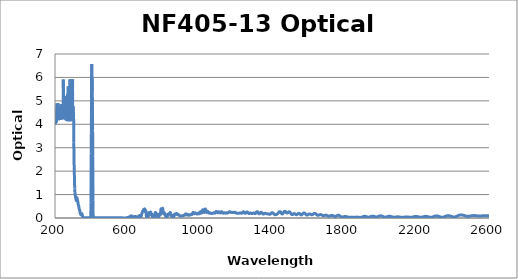
| Category | Optical Density |
|---|---|
| 2600.0 | 0.089 |
| 2599.0 | 0.09 |
| 2598.0 | 0.091 |
| 2597.0 | 0.091 |
| 2596.0 | 0.092 |
| 2595.0 | 0.093 |
| 2594.0 | 0.094 |
| 2593.0 | 0.095 |
| 2592.0 | 0.096 |
| 2591.0 | 0.096 |
| 2590.0 | 0.097 |
| 2589.0 | 0.098 |
| 2588.0 | 0.098 |
| 2587.0 | 0.099 |
| 2586.0 | 0.099 |
| 2585.0 | 0.1 |
| 2584.0 | 0.1 |
| 2583.0 | 0.1 |
| 2582.0 | 0.1 |
| 2581.0 | 0.1 |
| 2580.0 | 0.1 |
| 2579.0 | 0.1 |
| 2578.0 | 0.1 |
| 2577.0 | 0.1 |
| 2576.0 | 0.1 |
| 2575.0 | 0.099 |
| 2574.0 | 0.099 |
| 2573.0 | 0.099 |
| 2572.0 | 0.098 |
| 2571.0 | 0.098 |
| 2570.0 | 0.097 |
| 2569.0 | 0.096 |
| 2568.0 | 0.095 |
| 2567.0 | 0.095 |
| 2566.0 | 0.094 |
| 2565.0 | 0.093 |
| 2564.0 | 0.093 |
| 2563.0 | 0.092 |
| 2562.0 | 0.091 |
| 2561.0 | 0.09 |
| 2560.0 | 0.09 |
| 2559.0 | 0.089 |
| 2558.0 | 0.089 |
| 2557.0 | 0.088 |
| 2556.0 | 0.088 |
| 2555.0 | 0.087 |
| 2554.0 | 0.087 |
| 2553.0 | 0.087 |
| 2552.0 | 0.086 |
| 2551.0 | 0.086 |
| 2550.0 | 0.086 |
| 2549.0 | 0.085 |
| 2548.0 | 0.086 |
| 2547.0 | 0.086 |
| 2546.0 | 0.086 |
| 2545.0 | 0.086 |
| 2544.0 | 0.086 |
| 2543.0 | 0.087 |
| 2542.0 | 0.087 |
| 2541.0 | 0.088 |
| 2540.0 | 0.089 |
| 2539.0 | 0.089 |
| 2538.0 | 0.09 |
| 2537.0 | 0.09 |
| 2536.0 | 0.091 |
| 2535.0 | 0.092 |
| 2534.0 | 0.093 |
| 2533.0 | 0.094 |
| 2532.0 | 0.095 |
| 2531.0 | 0.096 |
| 2530.0 | 0.096 |
| 2529.0 | 0.097 |
| 2528.0 | 0.098 |
| 2527.0 | 0.098 |
| 2526.0 | 0.099 |
| 2525.0 | 0.1 |
| 2524.0 | 0.101 |
| 2523.0 | 0.101 |
| 2522.0 | 0.102 |
| 2521.0 | 0.102 |
| 2520.0 | 0.102 |
| 2519.0 | 0.103 |
| 2518.0 | 0.103 |
| 2517.0 | 0.103 |
| 2516.0 | 0.103 |
| 2515.0 | 0.103 |
| 2514.0 | 0.103 |
| 2513.0 | 0.102 |
| 2512.0 | 0.102 |
| 2511.0 | 0.101 |
| 2510.0 | 0.101 |
| 2509.0 | 0.1 |
| 2508.0 | 0.099 |
| 2507.0 | 0.098 |
| 2506.0 | 0.097 |
| 2505.0 | 0.096 |
| 2504.0 | 0.095 |
| 2503.0 | 0.093 |
| 2502.0 | 0.092 |
| 2501.0 | 0.091 |
| 2500.0 | 0.089 |
| 2499.0 | 0.088 |
| 2498.0 | 0.086 |
| 2497.0 | 0.085 |
| 2496.0 | 0.083 |
| 2495.0 | 0.082 |
| 2494.0 | 0.081 |
| 2493.0 | 0.08 |
| 2492.0 | 0.078 |
| 2491.0 | 0.077 |
| 2490.0 | 0.076 |
| 2489.0 | 0.075 |
| 2488.0 | 0.074 |
| 2487.0 | 0.074 |
| 2486.0 | 0.073 |
| 2485.0 | 0.073 |
| 2484.0 | 0.072 |
| 2483.0 | 0.072 |
| 2482.0 | 0.072 |
| 2481.0 | 0.073 |
| 2480.0 | 0.073 |
| 2479.0 | 0.074 |
| 2478.0 | 0.074 |
| 2477.0 | 0.075 |
| 2476.0 | 0.076 |
| 2475.0 | 0.078 |
| 2474.0 | 0.079 |
| 2473.0 | 0.081 |
| 2472.0 | 0.083 |
| 2471.0 | 0.085 |
| 2470.0 | 0.087 |
| 2469.0 | 0.089 |
| 2468.0 | 0.091 |
| 2467.0 | 0.094 |
| 2466.0 | 0.096 |
| 2465.0 | 0.099 |
| 2464.0 | 0.101 |
| 2463.0 | 0.104 |
| 2462.0 | 0.106 |
| 2461.0 | 0.109 |
| 2460.0 | 0.111 |
| 2459.0 | 0.114 |
| 2458.0 | 0.116 |
| 2457.0 | 0.118 |
| 2456.0 | 0.12 |
| 2455.0 | 0.122 |
| 2454.0 | 0.124 |
| 2453.0 | 0.125 |
| 2452.0 | 0.127 |
| 2451.0 | 0.128 |
| 2450.0 | 0.129 |
| 2449.0 | 0.13 |
| 2448.0 | 0.131 |
| 2447.0 | 0.131 |
| 2446.0 | 0.132 |
| 2445.0 | 0.132 |
| 2444.0 | 0.132 |
| 2443.0 | 0.131 |
| 2442.0 | 0.13 |
| 2441.0 | 0.13 |
| 2440.0 | 0.128 |
| 2439.0 | 0.127 |
| 2438.0 | 0.125 |
| 2437.0 | 0.123 |
| 2436.0 | 0.121 |
| 2435.0 | 0.119 |
| 2434.0 | 0.116 |
| 2433.0 | 0.114 |
| 2432.0 | 0.111 |
| 2431.0 | 0.108 |
| 2430.0 | 0.104 |
| 2429.0 | 0.101 |
| 2428.0 | 0.097 |
| 2427.0 | 0.094 |
| 2426.0 | 0.09 |
| 2425.0 | 0.086 |
| 2424.0 | 0.083 |
| 2423.0 | 0.079 |
| 2422.0 | 0.075 |
| 2421.0 | 0.072 |
| 2420.0 | 0.068 |
| 2419.0 | 0.065 |
| 2418.0 | 0.062 |
| 2417.0 | 0.058 |
| 2416.0 | 0.056 |
| 2415.0 | 0.053 |
| 2414.0 | 0.051 |
| 2413.0 | 0.049 |
| 2412.0 | 0.047 |
| 2411.0 | 0.045 |
| 2410.0 | 0.044 |
| 2409.0 | 0.043 |
| 2408.0 | 0.042 |
| 2407.0 | 0.041 |
| 2406.0 | 0.041 |
| 2405.0 | 0.041 |
| 2404.0 | 0.042 |
| 2403.0 | 0.043 |
| 2402.0 | 0.044 |
| 2401.0 | 0.045 |
| 2400.0 | 0.047 |
| 2399.0 | 0.049 |
| 2398.0 | 0.051 |
| 2397.0 | 0.053 |
| 2396.0 | 0.055 |
| 2395.0 | 0.058 |
| 2394.0 | 0.061 |
| 2393.0 | 0.063 |
| 2392.0 | 0.066 |
| 2391.0 | 0.069 |
| 2390.0 | 0.072 |
| 2389.0 | 0.075 |
| 2388.0 | 0.078 |
| 2387.0 | 0.081 |
| 2386.0 | 0.083 |
| 2385.0 | 0.086 |
| 2384.0 | 0.088 |
| 2383.0 | 0.09 |
| 2382.0 | 0.092 |
| 2381.0 | 0.094 |
| 2380.0 | 0.095 |
| 2379.0 | 0.097 |
| 2378.0 | 0.097 |
| 2377.0 | 0.098 |
| 2376.0 | 0.099 |
| 2375.0 | 0.099 |
| 2374.0 | 0.099 |
| 2373.0 | 0.098 |
| 2372.0 | 0.098 |
| 2371.0 | 0.097 |
| 2370.0 | 0.096 |
| 2369.0 | 0.094 |
| 2368.0 | 0.093 |
| 2367.0 | 0.091 |
| 2366.0 | 0.089 |
| 2365.0 | 0.087 |
| 2364.0 | 0.084 |
| 2363.0 | 0.081 |
| 2362.0 | 0.079 |
| 2361.0 | 0.076 |
| 2360.0 | 0.072 |
| 2359.0 | 0.069 |
| 2358.0 | 0.066 |
| 2357.0 | 0.063 |
| 2356.0 | 0.059 |
| 2355.0 | 0.056 |
| 2354.0 | 0.053 |
| 2353.0 | 0.05 |
| 2352.0 | 0.046 |
| 2351.0 | 0.043 |
| 2350.0 | 0.041 |
| 2349.0 | 0.038 |
| 2348.0 | 0.036 |
| 2347.0 | 0.034 |
| 2346.0 | 0.033 |
| 2345.0 | 0.031 |
| 2344.0 | 0.03 |
| 2343.0 | 0.029 |
| 2342.0 | 0.029 |
| 2341.0 | 0.029 |
| 2340.0 | 0.029 |
| 2339.0 | 0.03 |
| 2338.0 | 0.031 |
| 2337.0 | 0.032 |
| 2336.0 | 0.034 |
| 2335.0 | 0.035 |
| 2334.0 | 0.037 |
| 2333.0 | 0.04 |
| 2332.0 | 0.042 |
| 2331.0 | 0.045 |
| 2330.0 | 0.047 |
| 2329.0 | 0.05 |
| 2328.0 | 0.053 |
| 2327.0 | 0.056 |
| 2326.0 | 0.059 |
| 2325.0 | 0.062 |
| 2324.0 | 0.065 |
| 2323.0 | 0.068 |
| 2322.0 | 0.071 |
| 2321.0 | 0.074 |
| 2320.0 | 0.076 |
| 2319.0 | 0.079 |
| 2318.0 | 0.081 |
| 2317.0 | 0.083 |
| 2316.0 | 0.085 |
| 2315.0 | 0.086 |
| 2314.0 | 0.088 |
| 2313.0 | 0.089 |
| 2312.0 | 0.09 |
| 2311.0 | 0.09 |
| 2310.0 | 0.09 |
| 2309.0 | 0.09 |
| 2308.0 | 0.09 |
| 2307.0 | 0.089 |
| 2306.0 | 0.088 |
| 2305.0 | 0.087 |
| 2304.0 | 0.085 |
| 2303.0 | 0.083 |
| 2302.0 | 0.081 |
| 2301.0 | 0.079 |
| 2300.0 | 0.077 |
| 2299.0 | 0.074 |
| 2298.0 | 0.071 |
| 2297.0 | 0.068 |
| 2296.0 | 0.065 |
| 2295.0 | 0.063 |
| 2294.0 | 0.06 |
| 2293.0 | 0.057 |
| 2292.0 | 0.054 |
| 2291.0 | 0.051 |
| 2290.0 | 0.048 |
| 2289.0 | 0.045 |
| 2288.0 | 0.043 |
| 2287.0 | 0.04 |
| 2286.0 | 0.038 |
| 2285.0 | 0.036 |
| 2284.0 | 0.034 |
| 2283.0 | 0.032 |
| 2282.0 | 0.031 |
| 2281.0 | 0.03 |
| 2280.0 | 0.029 |
| 2279.0 | 0.029 |
| 2278.0 | 0.028 |
| 2277.0 | 0.029 |
| 2276.0 | 0.029 |
| 2275.0 | 0.03 |
| 2274.0 | 0.031 |
| 2273.0 | 0.032 |
| 2272.0 | 0.033 |
| 2271.0 | 0.035 |
| 2270.0 | 0.037 |
| 2269.0 | 0.039 |
| 2268.0 | 0.041 |
| 2267.0 | 0.044 |
| 2266.0 | 0.046 |
| 2265.0 | 0.048 |
| 2264.0 | 0.05 |
| 2263.0 | 0.053 |
| 2262.0 | 0.055 |
| 2261.0 | 0.057 |
| 2260.0 | 0.059 |
| 2259.0 | 0.061 |
| 2258.0 | 0.063 |
| 2257.0 | 0.064 |
| 2256.0 | 0.066 |
| 2255.0 | 0.067 |
| 2254.0 | 0.068 |
| 2253.0 | 0.069 |
| 2252.0 | 0.069 |
| 2251.0 | 0.07 |
| 2250.0 | 0.07 |
| 2249.0 | 0.07 |
| 2248.0 | 0.069 |
| 2247.0 | 0.069 |
| 2246.0 | 0.068 |
| 2245.0 | 0.067 |
| 2244.0 | 0.066 |
| 2243.0 | 0.064 |
| 2242.0 | 0.062 |
| 2241.0 | 0.061 |
| 2240.0 | 0.059 |
| 2239.0 | 0.057 |
| 2238.0 | 0.055 |
| 2237.0 | 0.053 |
| 2236.0 | 0.051 |
| 2235.0 | 0.048 |
| 2234.0 | 0.046 |
| 2233.0 | 0.044 |
| 2232.0 | 0.042 |
| 2231.0 | 0.04 |
| 2230.0 | 0.039 |
| 2229.0 | 0.037 |
| 2228.0 | 0.036 |
| 2227.0 | 0.035 |
| 2226.0 | 0.034 |
| 2225.0 | 0.033 |
| 2224.0 | 0.033 |
| 2223.0 | 0.032 |
| 2222.0 | 0.032 |
| 2221.0 | 0.033 |
| 2220.0 | 0.033 |
| 2219.0 | 0.034 |
| 2218.0 | 0.035 |
| 2217.0 | 0.036 |
| 2216.0 | 0.038 |
| 2215.0 | 0.039 |
| 2214.0 | 0.041 |
| 2213.0 | 0.043 |
| 2212.0 | 0.044 |
| 2211.0 | 0.046 |
| 2210.0 | 0.048 |
| 2209.0 | 0.05 |
| 2208.0 | 0.052 |
| 2207.0 | 0.054 |
| 2206.0 | 0.056 |
| 2205.0 | 0.058 |
| 2204.0 | 0.059 |
| 2203.0 | 0.061 |
| 2202.0 | 0.062 |
| 2201.0 | 0.063 |
| 2200.0 | 0.064 |
| 2199.0 | 0.065 |
| 2198.0 | 0.066 |
| 2197.0 | 0.066 |
| 2196.0 | 0.066 |
| 2195.0 | 0.066 |
| 2194.0 | 0.066 |
| 2193.0 | 0.065 |
| 2192.0 | 0.064 |
| 2191.0 | 0.064 |
| 2190.0 | 0.062 |
| 2189.0 | 0.061 |
| 2188.0 | 0.059 |
| 2187.0 | 0.058 |
| 2186.0 | 0.056 |
| 2185.0 | 0.054 |
| 2184.0 | 0.052 |
| 2183.0 | 0.05 |
| 2182.0 | 0.048 |
| 2181.0 | 0.045 |
| 2180.0 | 0.043 |
| 2179.0 | 0.041 |
| 2178.0 | 0.039 |
| 2177.0 | 0.037 |
| 2176.0 | 0.036 |
| 2175.0 | 0.034 |
| 2174.0 | 0.032 |
| 2173.0 | 0.031 |
| 2172.0 | 0.03 |
| 2171.0 | 0.029 |
| 2170.0 | 0.028 |
| 2169.0 | 0.028 |
| 2168.0 | 0.027 |
| 2167.0 | 0.027 |
| 2166.0 | 0.027 |
| 2165.0 | 0.027 |
| 2164.0 | 0.028 |
| 2163.0 | 0.028 |
| 2162.0 | 0.029 |
| 2161.0 | 0.03 |
| 2160.0 | 0.031 |
| 2159.0 | 0.033 |
| 2158.0 | 0.034 |
| 2157.0 | 0.035 |
| 2156.0 | 0.037 |
| 2155.0 | 0.038 |
| 2154.0 | 0.039 |
| 2153.0 | 0.041 |
| 2152.0 | 0.042 |
| 2151.0 | 0.043 |
| 2150.0 | 0.044 |
| 2149.0 | 0.045 |
| 2148.0 | 0.046 |
| 2147.0 | 0.047 |
| 2146.0 | 0.047 |
| 2145.0 | 0.047 |
| 2144.0 | 0.047 |
| 2143.0 | 0.047 |
| 2142.0 | 0.047 |
| 2141.0 | 0.047 |
| 2140.0 | 0.046 |
| 2139.0 | 0.045 |
| 2138.0 | 0.045 |
| 2137.0 | 0.043 |
| 2136.0 | 0.042 |
| 2135.0 | 0.041 |
| 2134.0 | 0.04 |
| 2133.0 | 0.039 |
| 2132.0 | 0.037 |
| 2131.0 | 0.036 |
| 2130.0 | 0.034 |
| 2129.0 | 0.033 |
| 2128.0 | 0.032 |
| 2127.0 | 0.031 |
| 2126.0 | 0.03 |
| 2125.0 | 0.029 |
| 2124.0 | 0.028 |
| 2123.0 | 0.027 |
| 2122.0 | 0.027 |
| 2121.0 | 0.026 |
| 2120.0 | 0.026 |
| 2119.0 | 0.026 |
| 2118.0 | 0.027 |
| 2117.0 | 0.027 |
| 2116.0 | 0.028 |
| 2115.0 | 0.029 |
| 2114.0 | 0.03 |
| 2113.0 | 0.031 |
| 2112.0 | 0.032 |
| 2111.0 | 0.033 |
| 2110.0 | 0.035 |
| 2109.0 | 0.036 |
| 2108.0 | 0.038 |
| 2107.0 | 0.04 |
| 2106.0 | 0.041 |
| 2105.0 | 0.042 |
| 2104.0 | 0.044 |
| 2103.0 | 0.045 |
| 2102.0 | 0.046 |
| 2101.0 | 0.047 |
| 2100.0 | 0.048 |
| 2099.0 | 0.049 |
| 2098.0 | 0.049 |
| 2097.0 | 0.05 |
| 2096.0 | 0.05 |
| 2095.0 | 0.05 |
| 2094.0 | 0.049 |
| 2093.0 | 0.049 |
| 2092.0 | 0.048 |
| 2091.0 | 0.047 |
| 2090.0 | 0.047 |
| 2089.0 | 0.046 |
| 2088.0 | 0.045 |
| 2087.0 | 0.043 |
| 2086.0 | 0.042 |
| 2085.0 | 0.041 |
| 2084.0 | 0.039 |
| 2083.0 | 0.038 |
| 2082.0 | 0.037 |
| 2081.0 | 0.036 |
| 2080.0 | 0.035 |
| 2079.0 | 0.034 |
| 2078.0 | 0.033 |
| 2077.0 | 0.033 |
| 2076.0 | 0.033 |
| 2075.0 | 0.033 |
| 2074.0 | 0.033 |
| 2073.0 | 0.034 |
| 2072.0 | 0.034 |
| 2071.0 | 0.036 |
| 2070.0 | 0.037 |
| 2069.0 | 0.039 |
| 2068.0 | 0.041 |
| 2067.0 | 0.043 |
| 2066.0 | 0.045 |
| 2065.0 | 0.047 |
| 2064.0 | 0.05 |
| 2063.0 | 0.052 |
| 2062.0 | 0.055 |
| 2061.0 | 0.057 |
| 2060.0 | 0.06 |
| 2059.0 | 0.062 |
| 2058.0 | 0.065 |
| 2057.0 | 0.067 |
| 2056.0 | 0.069 |
| 2055.0 | 0.071 |
| 2054.0 | 0.072 |
| 2053.0 | 0.073 |
| 2052.0 | 0.074 |
| 2051.0 | 0.075 |
| 2050.0 | 0.075 |
| 2049.0 | 0.076 |
| 2048.0 | 0.075 |
| 2047.0 | 0.075 |
| 2046.0 | 0.074 |
| 2045.0 | 0.073 |
| 2044.0 | 0.071 |
| 2043.0 | 0.07 |
| 2042.0 | 0.068 |
| 2041.0 | 0.065 |
| 2040.0 | 0.063 |
| 2039.0 | 0.061 |
| 2038.0 | 0.058 |
| 2037.0 | 0.055 |
| 2036.0 | 0.053 |
| 2035.0 | 0.05 |
| 2034.0 | 0.047 |
| 2033.0 | 0.045 |
| 2032.0 | 0.043 |
| 2031.0 | 0.041 |
| 2030.0 | 0.039 |
| 2029.0 | 0.037 |
| 2028.0 | 0.036 |
| 2027.0 | 0.036 |
| 2026.0 | 0.035 |
| 2025.0 | 0.036 |
| 2024.0 | 0.036 |
| 2023.0 | 0.037 |
| 2022.0 | 0.039 |
| 2021.0 | 0.041 |
| 2020.0 | 0.043 |
| 2019.0 | 0.046 |
| 2018.0 | 0.049 |
| 2017.0 | 0.052 |
| 2016.0 | 0.055 |
| 2015.0 | 0.058 |
| 2014.0 | 0.062 |
| 2013.0 | 0.065 |
| 2012.0 | 0.069 |
| 2011.0 | 0.072 |
| 2010.0 | 0.075 |
| 2009.0 | 0.078 |
| 2008.0 | 0.081 |
| 2007.0 | 0.084 |
| 2006.0 | 0.086 |
| 2005.0 | 0.088 |
| 2004.0 | 0.09 |
| 2003.0 | 0.091 |
| 2002.0 | 0.092 |
| 2001.0 | 0.093 |
| 2000.0 | 0.093 |
| 1999.0 | 0.092 |
| 1998.0 | 0.092 |
| 1997.0 | 0.09 |
| 1996.0 | 0.089 |
| 1995.0 | 0.087 |
| 1994.0 | 0.085 |
| 1993.0 | 0.082 |
| 1992.0 | 0.079 |
| 1991.0 | 0.076 |
| 1990.0 | 0.073 |
| 1989.0 | 0.07 |
| 1988.0 | 0.066 |
| 1987.0 | 0.063 |
| 1986.0 | 0.06 |
| 1985.0 | 0.057 |
| 1984.0 | 0.054 |
| 1983.0 | 0.052 |
| 1982.0 | 0.05 |
| 1981.0 | 0.048 |
| 1980.0 | 0.046 |
| 1979.0 | 0.045 |
| 1978.0 | 0.045 |
| 1977.0 | 0.044 |
| 1976.0 | 0.045 |
| 1975.0 | 0.045 |
| 1974.0 | 0.046 |
| 1973.0 | 0.047 |
| 1972.0 | 0.049 |
| 1971.0 | 0.051 |
| 1970.0 | 0.053 |
| 1969.0 | 0.056 |
| 1968.0 | 0.058 |
| 1967.0 | 0.061 |
| 1966.0 | 0.063 |
| 1965.0 | 0.066 |
| 1964.0 | 0.068 |
| 1963.0 | 0.071 |
| 1962.0 | 0.073 |
| 1961.0 | 0.075 |
| 1960.0 | 0.076 |
| 1959.0 | 0.077 |
| 1958.0 | 0.078 |
| 1957.0 | 0.079 |
| 1956.0 | 0.079 |
| 1955.0 | 0.079 |
| 1954.0 | 0.078 |
| 1953.0 | 0.077 |
| 1952.0 | 0.076 |
| 1951.0 | 0.074 |
| 1950.0 | 0.072 |
| 1949.0 | 0.069 |
| 1948.0 | 0.067 |
| 1947.0 | 0.064 |
| 1946.0 | 0.061 |
| 1945.0 | 0.058 |
| 1944.0 | 0.054 |
| 1943.0 | 0.051 |
| 1942.0 | 0.048 |
| 1941.0 | 0.046 |
| 1940.0 | 0.043 |
| 1939.0 | 0.04 |
| 1938.0 | 0.039 |
| 1937.0 | 0.037 |
| 1936.0 | 0.036 |
| 1935.0 | 0.035 |
| 1934.0 | 0.034 |
| 1933.0 | 0.034 |
| 1932.0 | 0.035 |
| 1931.0 | 0.036 |
| 1930.0 | 0.037 |
| 1929.0 | 0.038 |
| 1928.0 | 0.04 |
| 1927.0 | 0.043 |
| 1926.0 | 0.045 |
| 1925.0 | 0.048 |
| 1924.0 | 0.05 |
| 1923.0 | 0.053 |
| 1922.0 | 0.056 |
| 1921.0 | 0.058 |
| 1920.0 | 0.061 |
| 1919.0 | 0.064 |
| 1918.0 | 0.066 |
| 1917.0 | 0.068 |
| 1916.0 | 0.069 |
| 1915.0 | 0.07 |
| 1914.0 | 0.071 |
| 1913.0 | 0.071 |
| 1912.0 | 0.072 |
| 1911.0 | 0.071 |
| 1910.0 | 0.071 |
| 1909.0 | 0.07 |
| 1908.0 | 0.068 |
| 1907.0 | 0.066 |
| 1906.0 | 0.064 |
| 1905.0 | 0.061 |
| 1904.0 | 0.058 |
| 1903.0 | 0.056 |
| 1902.0 | 0.053 |
| 1901.0 | 0.05 |
| 1900.0 | 0.047 |
| 1899.0 | 0.043 |
| 1898.0 | 0.04 |
| 1897.0 | 0.038 |
| 1896.0 | 0.035 |
| 1895.0 | 0.033 |
| 1894.0 | 0.031 |
| 1893.0 | 0.029 |
| 1892.0 | 0.027 |
| 1891.0 | 0.026 |
| 1890.0 | 0.025 |
| 1889.0 | 0.025 |
| 1888.0 | 0.024 |
| 1887.0 | 0.024 |
| 1886.0 | 0.025 |
| 1885.0 | 0.025 |
| 1884.0 | 0.026 |
| 1883.0 | 0.027 |
| 1882.0 | 0.028 |
| 1881.0 | 0.029 |
| 1880.0 | 0.03 |
| 1879.0 | 0.031 |
| 1878.0 | 0.032 |
| 1877.0 | 0.034 |
| 1876.0 | 0.035 |
| 1875.0 | 0.035 |
| 1874.0 | 0.036 |
| 1873.0 | 0.037 |
| 1872.0 | 0.037 |
| 1871.0 | 0.038 |
| 1870.0 | 0.038 |
| 1869.0 | 0.038 |
| 1868.0 | 0.038 |
| 1867.0 | 0.037 |
| 1866.0 | 0.037 |
| 1865.0 | 0.036 |
| 1864.0 | 0.035 |
| 1863.0 | 0.034 |
| 1862.0 | 0.033 |
| 1861.0 | 0.033 |
| 1860.0 | 0.032 |
| 1859.0 | 0.031 |
| 1858.0 | 0.031 |
| 1857.0 | 0.03 |
| 1856.0 | 0.029 |
| 1855.0 | 0.029 |
| 1854.0 | 0.029 |
| 1853.0 | 0.029 |
| 1852.0 | 0.029 |
| 1851.0 | 0.029 |
| 1850.0 | 0.029 |
| 1849.0 | 0.029 |
| 1848.0 | 0.029 |
| 1847.0 | 0.029 |
| 1846.0 | 0.03 |
| 1845.0 | 0.03 |
| 1844.0 | 0.03 |
| 1843.0 | 0.03 |
| 1842.0 | 0.03 |
| 1841.0 | 0.03 |
| 1840.0 | 0.03 |
| 1839.0 | 0.03 |
| 1838.0 | 0.03 |
| 1837.0 | 0.03 |
| 1836.0 | 0.029 |
| 1835.0 | 0.029 |
| 1834.0 | 0.029 |
| 1833.0 | 0.028 |
| 1832.0 | 0.028 |
| 1831.0 | 0.028 |
| 1830.0 | 0.028 |
| 1829.0 | 0.028 |
| 1828.0 | 0.028 |
| 1827.0 | 0.028 |
| 1826.0 | 0.029 |
| 1825.0 | 0.03 |
| 1824.0 | 0.031 |
| 1823.0 | 0.032 |
| 1822.0 | 0.033 |
| 1821.0 | 0.035 |
| 1820.0 | 0.037 |
| 1819.0 | 0.04 |
| 1818.0 | 0.042 |
| 1817.0 | 0.045 |
| 1816.0 | 0.047 |
| 1815.0 | 0.049 |
| 1814.0 | 0.052 |
| 1813.0 | 0.054 |
| 1812.0 | 0.056 |
| 1811.0 | 0.058 |
| 1810.0 | 0.06 |
| 1809.0 | 0.062 |
| 1808.0 | 0.063 |
| 1807.0 | 0.064 |
| 1806.0 | 0.064 |
| 1805.0 | 0.064 |
| 1804.0 | 0.064 |
| 1803.0 | 0.063 |
| 1802.0 | 0.062 |
| 1801.0 | 0.061 |
| 1800.0 | 0.059 |
| 1799.0 | 0.057 |
| 1798.0 | 0.055 |
| 1797.0 | 0.052 |
| 1796.0 | 0.05 |
| 1795.0 | 0.048 |
| 1794.0 | 0.046 |
| 1793.0 | 0.044 |
| 1792.0 | 0.042 |
| 1791.0 | 0.041 |
| 1790.0 | 0.04 |
| 1789.0 | 0.04 |
| 1788.0 | 0.04 |
| 1787.0 | 0.041 |
| 1786.0 | 0.043 |
| 1785.0 | 0.046 |
| 1784.0 | 0.049 |
| 1783.0 | 0.053 |
| 1782.0 | 0.057 |
| 1781.0 | 0.062 |
| 1780.0 | 0.067 |
| 1779.0 | 0.072 |
| 1778.0 | 0.078 |
| 1777.0 | 0.083 |
| 1776.0 | 0.089 |
| 1775.0 | 0.094 |
| 1774.0 | 0.098 |
| 1773.0 | 0.103 |
| 1772.0 | 0.107 |
| 1771.0 | 0.11 |
| 1770.0 | 0.113 |
| 1769.0 | 0.115 |
| 1768.0 | 0.116 |
| 1767.0 | 0.117 |
| 1766.0 | 0.117 |
| 1765.0 | 0.116 |
| 1764.0 | 0.115 |
| 1763.0 | 0.113 |
| 1762.0 | 0.11 |
| 1761.0 | 0.107 |
| 1760.0 | 0.103 |
| 1759.0 | 0.099 |
| 1758.0 | 0.094 |
| 1757.0 | 0.09 |
| 1756.0 | 0.085 |
| 1755.0 | 0.081 |
| 1754.0 | 0.077 |
| 1753.0 | 0.073 |
| 1752.0 | 0.07 |
| 1751.0 | 0.068 |
| 1750.0 | 0.066 |
| 1749.0 | 0.065 |
| 1748.0 | 0.065 |
| 1747.0 | 0.066 |
| 1746.0 | 0.068 |
| 1745.0 | 0.07 |
| 1744.0 | 0.073 |
| 1743.0 | 0.076 |
| 1742.0 | 0.08 |
| 1741.0 | 0.084 |
| 1740.0 | 0.088 |
| 1739.0 | 0.092 |
| 1738.0 | 0.096 |
| 1737.0 | 0.099 |
| 1736.0 | 0.102 |
| 1735.0 | 0.105 |
| 1734.0 | 0.107 |
| 1733.0 | 0.109 |
| 1732.0 | 0.11 |
| 1731.0 | 0.111 |
| 1730.0 | 0.111 |
| 1729.0 | 0.11 |
| 1728.0 | 0.108 |
| 1727.0 | 0.106 |
| 1726.0 | 0.104 |
| 1725.0 | 0.101 |
| 1724.0 | 0.098 |
| 1723.0 | 0.095 |
| 1722.0 | 0.092 |
| 1721.0 | 0.088 |
| 1720.0 | 0.085 |
| 1719.0 | 0.083 |
| 1718.0 | 0.081 |
| 1717.0 | 0.079 |
| 1716.0 | 0.078 |
| 1715.0 | 0.077 |
| 1714.0 | 0.077 |
| 1713.0 | 0.079 |
| 1712.0 | 0.08 |
| 1711.0 | 0.083 |
| 1710.0 | 0.086 |
| 1709.0 | 0.089 |
| 1708.0 | 0.092 |
| 1707.0 | 0.096 |
| 1706.0 | 0.1 |
| 1705.0 | 0.103 |
| 1704.0 | 0.107 |
| 1703.0 | 0.11 |
| 1702.0 | 0.113 |
| 1701.0 | 0.115 |
| 1700.0 | 0.117 |
| 1699.0 | 0.118 |
| 1698.0 | 0.118 |
| 1697.0 | 0.118 |
| 1696.0 | 0.118 |
| 1695.0 | 0.116 |
| 1694.0 | 0.115 |
| 1693.0 | 0.113 |
| 1692.0 | 0.111 |
| 1691.0 | 0.109 |
| 1690.0 | 0.107 |
| 1689.0 | 0.105 |
| 1688.0 | 0.103 |
| 1687.0 | 0.102 |
| 1686.0 | 0.101 |
| 1685.0 | 0.101 |
| 1684.0 | 0.101 |
| 1683.0 | 0.102 |
| 1682.0 | 0.104 |
| 1681.0 | 0.106 |
| 1680.0 | 0.109 |
| 1679.0 | 0.112 |
| 1678.0 | 0.116 |
| 1677.0 | 0.12 |
| 1676.0 | 0.125 |
| 1675.0 | 0.129 |
| 1674.0 | 0.133 |
| 1673.0 | 0.137 |
| 1672.0 | 0.14 |
| 1671.0 | 0.143 |
| 1670.0 | 0.145 |
| 1669.0 | 0.146 |
| 1668.0 | 0.147 |
| 1667.0 | 0.146 |
| 1666.0 | 0.145 |
| 1665.0 | 0.144 |
| 1664.0 | 0.141 |
| 1663.0 | 0.138 |
| 1662.0 | 0.135 |
| 1661.0 | 0.132 |
| 1660.0 | 0.128 |
| 1659.0 | 0.125 |
| 1658.0 | 0.122 |
| 1657.0 | 0.119 |
| 1656.0 | 0.117 |
| 1655.0 | 0.116 |
| 1654.0 | 0.116 |
| 1653.0 | 0.117 |
| 1652.0 | 0.119 |
| 1651.0 | 0.122 |
| 1650.0 | 0.125 |
| 1649.0 | 0.13 |
| 1648.0 | 0.135 |
| 1647.0 | 0.142 |
| 1646.0 | 0.148 |
| 1645.0 | 0.155 |
| 1644.0 | 0.162 |
| 1643.0 | 0.168 |
| 1642.0 | 0.175 |
| 1641.0 | 0.181 |
| 1640.0 | 0.186 |
| 1639.0 | 0.19 |
| 1638.0 | 0.193 |
| 1637.0 | 0.195 |
| 1636.0 | 0.195 |
| 1635.0 | 0.195 |
| 1634.0 | 0.194 |
| 1633.0 | 0.191 |
| 1632.0 | 0.187 |
| 1631.0 | 0.183 |
| 1630.0 | 0.178 |
| 1629.0 | 0.173 |
| 1628.0 | 0.167 |
| 1627.0 | 0.161 |
| 1626.0 | 0.156 |
| 1625.0 | 0.151 |
| 1624.0 | 0.146 |
| 1623.0 | 0.143 |
| 1622.0 | 0.141 |
| 1621.0 | 0.14 |
| 1620.0 | 0.14 |
| 1619.0 | 0.141 |
| 1618.0 | 0.143 |
| 1617.0 | 0.146 |
| 1616.0 | 0.149 |
| 1615.0 | 0.153 |
| 1614.0 | 0.157 |
| 1613.0 | 0.161 |
| 1612.0 | 0.165 |
| 1611.0 | 0.169 |
| 1610.0 | 0.172 |
| 1609.0 | 0.174 |
| 1608.0 | 0.175 |
| 1607.0 | 0.176 |
| 1606.0 | 0.175 |
| 1605.0 | 0.173 |
| 1604.0 | 0.17 |
| 1603.0 | 0.166 |
| 1602.0 | 0.162 |
| 1601.0 | 0.156 |
| 1600.0 | 0.15 |
| 1599.0 | 0.144 |
| 1598.0 | 0.139 |
| 1597.0 | 0.133 |
| 1596.0 | 0.129 |
| 1595.0 | 0.126 |
| 1594.0 | 0.124 |
| 1593.0 | 0.124 |
| 1592.0 | 0.125 |
| 1591.0 | 0.128 |
| 1590.0 | 0.133 |
| 1589.0 | 0.139 |
| 1588.0 | 0.147 |
| 1587.0 | 0.155 |
| 1586.0 | 0.164 |
| 1585.0 | 0.173 |
| 1584.0 | 0.182 |
| 1583.0 | 0.19 |
| 1582.0 | 0.197 |
| 1581.0 | 0.203 |
| 1580.0 | 0.208 |
| 1579.0 | 0.212 |
| 1578.0 | 0.214 |
| 1577.0 | 0.214 |
| 1576.0 | 0.213 |
| 1575.0 | 0.21 |
| 1574.0 | 0.206 |
| 1573.0 | 0.201 |
| 1572.0 | 0.194 |
| 1571.0 | 0.186 |
| 1570.0 | 0.178 |
| 1569.0 | 0.17 |
| 1568.0 | 0.161 |
| 1567.0 | 0.154 |
| 1566.0 | 0.147 |
| 1565.0 | 0.14 |
| 1564.0 | 0.136 |
| 1563.0 | 0.133 |
| 1562.0 | 0.132 |
| 1561.0 | 0.133 |
| 1560.0 | 0.136 |
| 1559.0 | 0.14 |
| 1558.0 | 0.146 |
| 1557.0 | 0.153 |
| 1556.0 | 0.16 |
| 1555.0 | 0.167 |
| 1554.0 | 0.175 |
| 1553.0 | 0.181 |
| 1552.0 | 0.187 |
| 1551.0 | 0.192 |
| 1550.0 | 0.195 |
| 1549.0 | 0.196 |
| 1548.0 | 0.197 |
| 1547.0 | 0.195 |
| 1546.0 | 0.193 |
| 1545.0 | 0.188 |
| 1544.0 | 0.183 |
| 1543.0 | 0.177 |
| 1542.0 | 0.171 |
| 1541.0 | 0.164 |
| 1540.0 | 0.158 |
| 1539.0 | 0.153 |
| 1538.0 | 0.148 |
| 1537.0 | 0.145 |
| 1536.0 | 0.143 |
| 1535.0 | 0.142 |
| 1534.0 | 0.143 |
| 1533.0 | 0.146 |
| 1532.0 | 0.149 |
| 1531.0 | 0.154 |
| 1530.0 | 0.159 |
| 1529.0 | 0.165 |
| 1528.0 | 0.17 |
| 1527.0 | 0.176 |
| 1526.0 | 0.18 |
| 1525.0 | 0.184 |
| 1524.0 | 0.187 |
| 1523.0 | 0.188 |
| 1522.0 | 0.188 |
| 1521.0 | 0.186 |
| 1520.0 | 0.183 |
| 1519.0 | 0.178 |
| 1518.0 | 0.173 |
| 1517.0 | 0.168 |
| 1516.0 | 0.161 |
| 1515.0 | 0.155 |
| 1514.0 | 0.15 |
| 1513.0 | 0.146 |
| 1512.0 | 0.144 |
| 1511.0 | 0.144 |
| 1510.0 | 0.146 |
| 1509.0 | 0.15 |
| 1508.0 | 0.157 |
| 1507.0 | 0.165 |
| 1506.0 | 0.176 |
| 1505.0 | 0.186 |
| 1504.0 | 0.198 |
| 1503.0 | 0.21 |
| 1502.0 | 0.221 |
| 1501.0 | 0.233 |
| 1500.0 | 0.242 |
| 1499.0 | 0.25 |
| 1498.0 | 0.256 |
| 1497.0 | 0.261 |
| 1496.0 | 0.263 |
| 1495.0 | 0.264 |
| 1494.0 | 0.263 |
| 1493.0 | 0.26 |
| 1492.0 | 0.256 |
| 1491.0 | 0.25 |
| 1490.0 | 0.244 |
| 1489.0 | 0.237 |
| 1488.0 | 0.231 |
| 1487.0 | 0.225 |
| 1486.0 | 0.22 |
| 1485.0 | 0.216 |
| 1484.0 | 0.215 |
| 1483.0 | 0.215 |
| 1482.0 | 0.218 |
| 1481.0 | 0.222 |
| 1480.0 | 0.229 |
| 1479.0 | 0.237 |
| 1478.0 | 0.245 |
| 1477.0 | 0.254 |
| 1476.0 | 0.263 |
| 1475.0 | 0.272 |
| 1474.0 | 0.278 |
| 1473.0 | 0.283 |
| 1472.0 | 0.286 |
| 1471.0 | 0.287 |
| 1470.0 | 0.286 |
| 1469.0 | 0.282 |
| 1468.0 | 0.277 |
| 1467.0 | 0.269 |
| 1466.0 | 0.259 |
| 1465.0 | 0.248 |
| 1464.0 | 0.235 |
| 1463.0 | 0.223 |
| 1462.0 | 0.21 |
| 1461.0 | 0.198 |
| 1460.0 | 0.189 |
| 1459.0 | 0.181 |
| 1458.0 | 0.176 |
| 1457.0 | 0.174 |
| 1456.0 | 0.174 |
| 1455.0 | 0.178 |
| 1454.0 | 0.184 |
| 1453.0 | 0.192 |
| 1452.0 | 0.202 |
| 1451.0 | 0.213 |
| 1450.0 | 0.224 |
| 1449.0 | 0.235 |
| 1448.0 | 0.245 |
| 1447.0 | 0.254 |
| 1446.0 | 0.261 |
| 1445.0 | 0.266 |
| 1444.0 | 0.27 |
| 1443.0 | 0.272 |
| 1442.0 | 0.271 |
| 1441.0 | 0.268 |
| 1440.0 | 0.263 |
| 1439.0 | 0.256 |
| 1438.0 | 0.248 |
| 1437.0 | 0.239 |
| 1436.0 | 0.23 |
| 1435.0 | 0.22 |
| 1434.0 | 0.21 |
| 1433.0 | 0.2 |
| 1432.0 | 0.191 |
| 1431.0 | 0.183 |
| 1430.0 | 0.175 |
| 1429.0 | 0.169 |
| 1428.0 | 0.164 |
| 1427.0 | 0.16 |
| 1426.0 | 0.156 |
| 1425.0 | 0.152 |
| 1424.0 | 0.15 |
| 1423.0 | 0.148 |
| 1422.0 | 0.146 |
| 1421.0 | 0.144 |
| 1420.0 | 0.143 |
| 1419.0 | 0.142 |
| 1418.0 | 0.142 |
| 1417.0 | 0.142 |
| 1416.0 | 0.144 |
| 1415.0 | 0.146 |
| 1414.0 | 0.149 |
| 1413.0 | 0.155 |
| 1412.0 | 0.161 |
| 1411.0 | 0.168 |
| 1410.0 | 0.175 |
| 1409.0 | 0.182 |
| 1408.0 | 0.19 |
| 1407.0 | 0.199 |
| 1406.0 | 0.207 |
| 1405.0 | 0.213 |
| 1404.0 | 0.218 |
| 1403.0 | 0.222 |
| 1402.0 | 0.225 |
| 1401.0 | 0.225 |
| 1400.0 | 0.223 |
| 1399.0 | 0.22 |
| 1398.0 | 0.217 |
| 1397.0 | 0.212 |
| 1396.0 | 0.204 |
| 1395.0 | 0.197 |
| 1394.0 | 0.188 |
| 1393.0 | 0.182 |
| 1392.0 | 0.176 |
| 1391.0 | 0.169 |
| 1390.0 | 0.165 |
| 1389.0 | 0.161 |
| 1388.0 | 0.159 |
| 1387.0 | 0.159 |
| 1386.0 | 0.16 |
| 1385.0 | 0.162 |
| 1384.0 | 0.165 |
| 1383.0 | 0.167 |
| 1382.0 | 0.17 |
| 1381.0 | 0.174 |
| 1380.0 | 0.176 |
| 1379.0 | 0.177 |
| 1378.0 | 0.177 |
| 1377.0 | 0.177 |
| 1376.0 | 0.177 |
| 1375.0 | 0.176 |
| 1374.0 | 0.176 |
| 1373.0 | 0.176 |
| 1372.0 | 0.177 |
| 1371.0 | 0.178 |
| 1370.0 | 0.18 |
| 1369.0 | 0.183 |
| 1368.0 | 0.186 |
| 1367.0 | 0.189 |
| 1366.0 | 0.193 |
| 1365.0 | 0.195 |
| 1364.0 | 0.198 |
| 1363.0 | 0.2 |
| 1362.0 | 0.201 |
| 1361.0 | 0.2 |
| 1360.0 | 0.199 |
| 1359.0 | 0.197 |
| 1358.0 | 0.192 |
| 1357.0 | 0.187 |
| 1356.0 | 0.181 |
| 1355.0 | 0.175 |
| 1354.0 | 0.171 |
| 1353.0 | 0.168 |
| 1352.0 | 0.167 |
| 1351.0 | 0.168 |
| 1350.0 | 0.171 |
| 1349.0 | 0.176 |
| 1348.0 | 0.183 |
| 1347.0 | 0.192 |
| 1346.0 | 0.202 |
| 1345.0 | 0.213 |
| 1344.0 | 0.222 |
| 1343.0 | 0.23 |
| 1342.0 | 0.236 |
| 1341.0 | 0.241 |
| 1340.0 | 0.243 |
| 1339.0 | 0.243 |
| 1338.0 | 0.24 |
| 1337.0 | 0.234 |
| 1336.0 | 0.227 |
| 1335.0 | 0.218 |
| 1334.0 | 0.208 |
| 1333.0 | 0.198 |
| 1332.0 | 0.19 |
| 1331.0 | 0.182 |
| 1330.0 | 0.178 |
| 1329.0 | 0.177 |
| 1328.0 | 0.179 |
| 1327.0 | 0.185 |
| 1326.0 | 0.193 |
| 1325.0 | 0.204 |
| 1324.0 | 0.216 |
| 1323.0 | 0.229 |
| 1322.0 | 0.241 |
| 1321.0 | 0.252 |
| 1320.0 | 0.261 |
| 1319.0 | 0.267 |
| 1318.0 | 0.27 |
| 1317.0 | 0.27 |
| 1316.0 | 0.266 |
| 1315.0 | 0.26 |
| 1314.0 | 0.251 |
| 1313.0 | 0.24 |
| 1312.0 | 0.229 |
| 1311.0 | 0.218 |
| 1310.0 | 0.207 |
| 1309.0 | 0.198 |
| 1308.0 | 0.192 |
| 1307.0 | 0.188 |
| 1306.0 | 0.188 |
| 1305.0 | 0.189 |
| 1304.0 | 0.193 |
| 1303.0 | 0.198 |
| 1302.0 | 0.203 |
| 1301.0 | 0.208 |
| 1300.0 | 0.212 |
| 1299.0 | 0.214 |
| 1298.0 | 0.215 |
| 1297.0 | 0.215 |
| 1296.0 | 0.212 |
| 1295.0 | 0.209 |
| 1294.0 | 0.204 |
| 1293.0 | 0.199 |
| 1292.0 | 0.194 |
| 1291.0 | 0.19 |
| 1290.0 | 0.188 |
| 1289.0 | 0.187 |
| 1288.0 | 0.187 |
| 1287.0 | 0.19 |
| 1286.0 | 0.193 |
| 1285.0 | 0.198 |
| 1284.0 | 0.203 |
| 1283.0 | 0.207 |
| 1282.0 | 0.211 |
| 1281.0 | 0.213 |
| 1280.0 | 0.214 |
| 1279.0 | 0.212 |
| 1278.0 | 0.209 |
| 1277.0 | 0.205 |
| 1276.0 | 0.201 |
| 1275.0 | 0.196 |
| 1274.0 | 0.193 |
| 1273.0 | 0.191 |
| 1272.0 | 0.192 |
| 1271.0 | 0.195 |
| 1270.0 | 0.201 |
| 1269.0 | 0.209 |
| 1268.0 | 0.218 |
| 1267.0 | 0.228 |
| 1266.0 | 0.238 |
| 1265.0 | 0.247 |
| 1264.0 | 0.254 |
| 1263.0 | 0.258 |
| 1262.0 | 0.259 |
| 1261.0 | 0.258 |
| 1260.0 | 0.253 |
| 1259.0 | 0.246 |
| 1258.0 | 0.238 |
| 1257.0 | 0.228 |
| 1256.0 | 0.219 |
| 1255.0 | 0.21 |
| 1254.0 | 0.203 |
| 1253.0 | 0.199 |
| 1252.0 | 0.199 |
| 1251.0 | 0.201 |
| 1250.0 | 0.207 |
| 1249.0 | 0.215 |
| 1248.0 | 0.225 |
| 1247.0 | 0.235 |
| 1246.0 | 0.245 |
| 1245.0 | 0.253 |
| 1244.0 | 0.26 |
| 1243.0 | 0.263 |
| 1242.0 | 0.263 |
| 1241.0 | 0.26 |
| 1240.0 | 0.255 |
| 1239.0 | 0.248 |
| 1238.0 | 0.239 |
| 1237.0 | 0.229 |
| 1236.0 | 0.22 |
| 1235.0 | 0.212 |
| 1234.0 | 0.206 |
| 1233.0 | 0.202 |
| 1232.0 | 0.201 |
| 1231.0 | 0.202 |
| 1230.0 | 0.204 |
| 1229.0 | 0.207 |
| 1228.0 | 0.211 |
| 1227.0 | 0.214 |
| 1226.0 | 0.216 |
| 1225.0 | 0.218 |
| 1224.0 | 0.218 |
| 1223.0 | 0.217 |
| 1222.0 | 0.215 |
| 1221.0 | 0.213 |
| 1220.0 | 0.211 |
| 1219.0 | 0.208 |
| 1218.0 | 0.207 |
| 1217.0 | 0.205 |
| 1216.0 | 0.205 |
| 1215.0 | 0.205 |
| 1214.0 | 0.205 |
| 1213.0 | 0.205 |
| 1212.0 | 0.206 |
| 1211.0 | 0.205 |
| 1210.0 | 0.205 |
| 1209.0 | 0.204 |
| 1208.0 | 0.203 |
| 1207.0 | 0.202 |
| 1206.0 | 0.202 |
| 1205.0 | 0.202 |
| 1204.0 | 0.203 |
| 1203.0 | 0.206 |
| 1202.0 | 0.21 |
| 1201.0 | 0.215 |
| 1200.0 | 0.222 |
| 1199.0 | 0.228 |
| 1198.0 | 0.235 |
| 1197.0 | 0.24 |
| 1196.0 | 0.244 |
| 1195.0 | 0.246 |
| 1194.0 | 0.247 |
| 1193.0 | 0.246 |
| 1192.0 | 0.244 |
| 1191.0 | 0.241 |
| 1190.0 | 0.237 |
| 1189.0 | 0.234 |
| 1188.0 | 0.231 |
| 1187.0 | 0.23 |
| 1186.0 | 0.23 |
| 1185.0 | 0.231 |
| 1184.0 | 0.233 |
| 1183.0 | 0.235 |
| 1182.0 | 0.238 |
| 1181.0 | 0.24 |
| 1180.0 | 0.241 |
| 1179.0 | 0.241 |
| 1178.0 | 0.241 |
| 1177.0 | 0.24 |
| 1176.0 | 0.239 |
| 1175.0 | 0.238 |
| 1174.0 | 0.238 |
| 1173.0 | 0.24 |
| 1172.0 | 0.242 |
| 1171.0 | 0.246 |
| 1170.0 | 0.251 |
| 1169.0 | 0.256 |
| 1168.0 | 0.261 |
| 1167.0 | 0.265 |
| 1166.0 | 0.268 |
| 1165.0 | 0.269 |
| 1164.0 | 0.267 |
| 1163.0 | 0.263 |
| 1162.0 | 0.257 |
| 1161.0 | 0.249 |
| 1160.0 | 0.24 |
| 1159.0 | 0.231 |
| 1158.0 | 0.224 |
| 1157.0 | 0.219 |
| 1156.0 | 0.216 |
| 1155.0 | 0.215 |
| 1154.0 | 0.216 |
| 1153.0 | 0.218 |
| 1152.0 | 0.221 |
| 1151.0 | 0.224 |
| 1150.0 | 0.225 |
| 1149.0 | 0.224 |
| 1148.0 | 0.222 |
| 1147.0 | 0.219 |
| 1146.0 | 0.215 |
| 1145.0 | 0.211 |
| 1144.0 | 0.208 |
| 1143.0 | 0.206 |
| 1142.0 | 0.206 |
| 1141.0 | 0.208 |
| 1140.0 | 0.212 |
| 1139.0 | 0.215 |
| 1138.0 | 0.219 |
| 1137.0 | 0.222 |
| 1136.0 | 0.223 |
| 1135.0 | 0.222 |
| 1134.0 | 0.219 |
| 1133.0 | 0.216 |
| 1132.0 | 0.212 |
| 1131.0 | 0.208 |
| 1130.0 | 0.206 |
| 1129.0 | 0.207 |
| 1128.0 | 0.211 |
| 1127.0 | 0.218 |
| 1126.0 | 0.227 |
| 1125.0 | 0.239 |
| 1124.0 | 0.25 |
| 1123.0 | 0.259 |
| 1122.0 | 0.266 |
| 1121.0 | 0.269 |
| 1120.0 | 0.267 |
| 1119.0 | 0.261 |
| 1118.0 | 0.252 |
| 1117.0 | 0.241 |
| 1116.0 | 0.23 |
| 1115.0 | 0.222 |
| 1114.0 | 0.217 |
| 1113.0 | 0.217 |
| 1112.0 | 0.221 |
| 1111.0 | 0.23 |
| 1110.0 | 0.24 |
| 1109.0 | 0.249 |
| 1108.0 | 0.257 |
| 1107.0 | 0.262 |
| 1106.0 | 0.262 |
| 1105.0 | 0.259 |
| 1104.0 | 0.252 |
| 1103.0 | 0.244 |
| 1102.0 | 0.235 |
| 1101.0 | 0.229 |
| 1100.0 | 0.227 |
| 1099.0 | 0.229 |
| 1098.0 | 0.235 |
| 1097.0 | 0.245 |
| 1096.0 | 0.256 |
| 1095.0 | 0.266 |
| 1094.0 | 0.275 |
| 1093.0 | 0.281 |
| 1092.0 | 0.282 |
| 1091.0 | 0.279 |
| 1090.0 | 0.27 |
| 1089.0 | 0.259 |
| 1088.0 | 0.245 |
| 1087.0 | 0.232 |
| 1086.0 | 0.219 |
| 1085.0 | 0.211 |
| 1084.0 | 0.206 |
| 1083.0 | 0.205 |
| 1082.0 | 0.208 |
| 1081.0 | 0.212 |
| 1080.0 | 0.217 |
| 1079.0 | 0.221 |
| 1078.0 | 0.222 |
| 1077.0 | 0.222 |
| 1076.0 | 0.219 |
| 1075.0 | 0.215 |
| 1074.0 | 0.211 |
| 1073.0 | 0.207 |
| 1072.0 | 0.203 |
| 1071.0 | 0.2 |
| 1070.0 | 0.198 |
| 1069.0 | 0.196 |
| 1068.0 | 0.194 |
| 1067.0 | 0.192 |
| 1066.0 | 0.19 |
| 1065.0 | 0.189 |
| 1064.0 | 0.189 |
| 1063.0 | 0.191 |
| 1062.0 | 0.195 |
| 1061.0 | 0.201 |
| 1060.0 | 0.208 |
| 1059.0 | 0.215 |
| 1058.0 | 0.22 |
| 1057.0 | 0.223 |
| 1056.0 | 0.223 |
| 1055.0 | 0.221 |
| 1054.0 | 0.216 |
| 1053.0 | 0.212 |
| 1052.0 | 0.209 |
| 1051.0 | 0.209 |
| 1050.0 | 0.215 |
| 1049.0 | 0.226 |
| 1048.0 | 0.24 |
| 1047.0 | 0.256 |
| 1046.0 | 0.27 |
| 1045.0 | 0.281 |
| 1044.0 | 0.285 |
| 1043.0 | 0.283 |
| 1042.0 | 0.273 |
| 1041.0 | 0.26 |
| 1040.0 | 0.246 |
| 1039.0 | 0.238 |
| 1038.0 | 0.238 |
| 1037.0 | 0.251 |
| 1036.0 | 0.273 |
| 1035.0 | 0.302 |
| 1034.0 | 0.335 |
| 1033.0 | 0.362 |
| 1032.0 | 0.382 |
| 1031.0 | 0.389 |
| 1030.0 | 0.384 |
| 1029.0 | 0.364 |
| 1028.0 | 0.335 |
| 1027.0 | 0.301 |
| 1026.0 | 0.267 |
| 1025.0 | 0.243 |
| 1024.0 | 0.235 |
| 1023.0 | 0.241 |
| 1022.0 | 0.261 |
| 1021.0 | 0.288 |
| 1020.0 | 0.317 |
| 1019.0 | 0.34 |
| 1018.0 | 0.35 |
| 1017.0 | 0.349 |
| 1016.0 | 0.335 |
| 1015.0 | 0.311 |
| 1014.0 | 0.28 |
| 1013.0 | 0.249 |
| 1012.0 | 0.226 |
| 1011.0 | 0.213 |
| 1010.0 | 0.212 |
| 1009.0 | 0.221 |
| 1008.0 | 0.239 |
| 1007.0 | 0.255 |
| 1006.0 | 0.268 |
| 1005.0 | 0.273 |
| 1004.0 | 0.268 |
| 1003.0 | 0.253 |
| 1002.0 | 0.233 |
| 1001.0 | 0.211 |
| 1000.0 | 0.192 |
| 999.0 | 0.18 |
| 998.0 | 0.178 |
| 997.0 | 0.183 |
| 996.0 | 0.193 |
| 995.0 | 0.203 |
| 994.0 | 0.21 |
| 993.0 | 0.212 |
| 992.0 | 0.208 |
| 991.0 | 0.2 |
| 990.0 | 0.189 |
| 989.0 | 0.179 |
| 988.0 | 0.171 |
| 987.0 | 0.167 |
| 986.0 | 0.166 |
| 985.0 | 0.168 |
| 984.0 | 0.171 |
| 983.0 | 0.176 |
| 982.0 | 0.181 |
| 981.0 | 0.188 |
| 980.0 | 0.195 |
| 979.0 | 0.202 |
| 978.0 | 0.21 |
| 977.0 | 0.216 |
| 976.0 | 0.219 |
| 975.0 | 0.218 |
| 974.0 | 0.213 |
| 973.0 | 0.205 |
| 972.0 | 0.195 |
| 971.0 | 0.186 |
| 970.0 | 0.182 |
| 969.0 | 0.184 |
| 968.0 | 0.192 |
| 967.0 | 0.205 |
| 966.0 | 0.221 |
| 965.0 | 0.232 |
| 964.0 | 0.239 |
| 963.0 | 0.237 |
| 962.0 | 0.226 |
| 961.0 | 0.209 |
| 960.0 | 0.187 |
| 959.0 | 0.168 |
| 958.0 | 0.155 |
| 957.0 | 0.147 |
| 956.0 | 0.147 |
| 955.0 | 0.15 |
| 954.0 | 0.154 |
| 953.0 | 0.154 |
| 952.0 | 0.15 |
| 951.0 | 0.143 |
| 950.0 | 0.134 |
| 949.0 | 0.126 |
| 948.0 | 0.123 |
| 947.0 | 0.124 |
| 946.0 | 0.127 |
| 945.0 | 0.132 |
| 944.0 | 0.134 |
| 943.0 | 0.133 |
| 942.0 | 0.128 |
| 941.0 | 0.122 |
| 940.0 | 0.116 |
| 939.0 | 0.115 |
| 938.0 | 0.12 |
| 937.0 | 0.13 |
| 936.0 | 0.141 |
| 935.0 | 0.151 |
| 934.0 | 0.156 |
| 933.0 | 0.155 |
| 932.0 | 0.149 |
| 931.0 | 0.139 |
| 930.0 | 0.131 |
| 929.0 | 0.127 |
| 928.0 | 0.13 |
| 927.0 | 0.139 |
| 926.0 | 0.153 |
| 925.0 | 0.166 |
| 924.0 | 0.175 |
| 923.0 | 0.177 |
| 922.0 | 0.171 |
| 921.0 | 0.16 |
| 920.0 | 0.147 |
| 919.0 | 0.135 |
| 918.0 | 0.128 |
| 917.0 | 0.126 |
| 916.0 | 0.125 |
| 915.0 | 0.124 |
| 914.0 | 0.121 |
| 913.0 | 0.115 |
| 912.0 | 0.107 |
| 911.0 | 0.099 |
| 910.0 | 0.094 |
| 909.0 | 0.093 |
| 908.0 | 0.094 |
| 907.0 | 0.097 |
| 906.0 | 0.098 |
| 905.0 | 0.098 |
| 904.0 | 0.094 |
| 903.0 | 0.09 |
| 902.0 | 0.086 |
| 901.0 | 0.083 |
| 900.0 | 0.082 |
| 899.0 | 0.082 |
| 898.0 | 0.083 |
| 897.0 | 0.083 |
| 896.0 | 0.082 |
| 895.0 | 0.081 |
| 894.0 | 0.081 |
| 893.0 | 0.082 |
| 892.0 | 0.085 |
| 891.0 | 0.09 |
| 890.0 | 0.095 |
| 889.0 | 0.1 |
| 888.0 | 0.105 |
| 887.0 | 0.11 |
| 886.0 | 0.116 |
| 885.0 | 0.124 |
| 884.0 | 0.132 |
| 883.0 | 0.141 |
| 882.0 | 0.147 |
| 881.0 | 0.149 |
| 880.0 | 0.149 |
| 879.0 | 0.147 |
| 878.0 | 0.147 |
| 877.0 | 0.15 |
| 876.0 | 0.159 |
| 875.0 | 0.172 |
| 874.0 | 0.185 |
| 873.0 | 0.194 |
| 872.0 | 0.195 |
| 871.0 | 0.188 |
| 870.0 | 0.176 |
| 869.0 | 0.164 |
| 868.0 | 0.156 |
| 867.0 | 0.154 |
| 866.0 | 0.157 |
| 865.0 | 0.165 |
| 864.0 | 0.172 |
| 863.0 | 0.174 |
| 862.0 | 0.169 |
| 861.0 | 0.159 |
| 860.0 | 0.138 |
| 859.0 | 0.101 |
| 858.0 | 0.066 |
| 857.0 | 0.054 |
| 856.0 | 0.062 |
| 855.0 | 0.076 |
| 854.0 | 0.083 |
| 853.0 | 0.078 |
| 852.0 | 0.066 |
| 851.0 | 0.058 |
| 850.0 | 0.061 |
| 849.0 | 0.077 |
| 848.0 | 0.099 |
| 847.0 | 0.115 |
| 846.0 | 0.115 |
| 845.0 | 0.1 |
| 844.0 | 0.081 |
| 843.0 | 0.071 |
| 842.0 | 0.082 |
| 841.0 | 0.114 |
| 840.0 | 0.159 |
| 839.0 | 0.202 |
| 838.0 | 0.231 |
| 837.0 | 0.24 |
| 836.0 | 0.231 |
| 835.0 | 0.211 |
| 834.0 | 0.189 |
| 833.0 | 0.171 |
| 832.0 | 0.161 |
| 831.0 | 0.158 |
| 830.0 | 0.16 |
| 829.0 | 0.165 |
| 828.0 | 0.169 |
| 827.0 | 0.172 |
| 826.0 | 0.169 |
| 825.0 | 0.156 |
| 824.0 | 0.134 |
| 823.0 | 0.105 |
| 822.0 | 0.077 |
| 821.0 | 0.058 |
| 820.0 | 0.051 |
| 819.0 | 0.054 |
| 818.0 | 0.058 |
| 817.0 | 0.054 |
| 816.0 | 0.041 |
| 815.0 | 0.03 |
| 814.0 | 0.033 |
| 813.0 | 0.056 |
| 812.0 | 0.094 |
| 811.0 | 0.134 |
| 810.0 | 0.159 |
| 809.0 | 0.163 |
| 808.0 | 0.153 |
| 807.0 | 0.146 |
| 806.0 | 0.156 |
| 805.0 | 0.186 |
| 804.0 | 0.219 |
| 803.0 | 0.239 |
| 802.0 | 0.234 |
| 801.0 | 0.212 |
| 800.0 | 0.195 |
| 799.0 | 0.209 |
| 798.0 | 0.26 |
| 797.0 | 0.333 |
| 796.0 | 0.394 |
| 795.0 | 0.416 |
| 794.0 | 0.387 |
| 793.0 | 0.319 |
| 792.0 | 0.245 |
| 791.0 | 0.207 |
| 790.0 | 0.224 |
| 789.0 | 0.287 |
| 788.0 | 0.355 |
| 787.0 | 0.392 |
| 786.0 | 0.377 |
| 785.0 | 0.316 |
| 784.0 | 0.236 |
| 783.0 | 0.168 |
| 782.0 | 0.135 |
| 781.0 | 0.138 |
| 780.0 | 0.16 |
| 779.0 | 0.179 |
| 778.0 | 0.179 |
| 777.0 | 0.158 |
| 776.0 | 0.122 |
| 775.0 | 0.082 |
| 774.0 | 0.05 |
| 773.0 | 0.036 |
| 772.0 | 0.041 |
| 771.0 | 0.06 |
| 770.0 | 0.079 |
| 769.0 | 0.085 |
| 768.0 | 0.07 |
| 767.0 | 0.046 |
| 766.0 | 0.04 |
| 765.0 | 0.066 |
| 764.0 | 0.116 |
| 763.0 | 0.165 |
| 762.0 | 0.185 |
| 761.0 | 0.168 |
| 760.0 | 0.132 |
| 759.0 | 0.11 |
| 758.0 | 0.128 |
| 757.0 | 0.179 |
| 756.0 | 0.227 |
| 755.0 | 0.237 |
| 754.0 | 0.201 |
| 753.0 | 0.139 |
| 752.0 | 0.091 |
| 751.0 | 0.079 |
| 750.0 | 0.099 |
| 749.0 | 0.119 |
| 748.0 | 0.11 |
| 747.0 | 0.072 |
| 746.0 | 0.039 |
| 745.0 | 0.039 |
| 744.0 | 0.066 |
| 743.0 | 0.091 |
| 742.0 | 0.089 |
| 741.0 | 0.062 |
| 740.0 | 0.04 |
| 739.0 | 0.054 |
| 738.0 | 0.102 |
| 737.0 | 0.152 |
| 736.0 | 0.172 |
| 735.0 | 0.154 |
| 734.0 | 0.127 |
| 733.0 | 0.122 |
| 732.0 | 0.149 |
| 731.0 | 0.195 |
| 730.0 | 0.235 |
| 729.0 | 0.253 |
| 728.0 | 0.248 |
| 727.0 | 0.231 |
| 726.0 | 0.211 |
| 725.0 | 0.197 |
| 724.0 | 0.195 |
| 723.0 | 0.206 |
| 722.0 | 0.227 |
| 721.0 | 0.239 |
| 720.0 | 0.222 |
| 719.0 | 0.168 |
| 718.0 | 0.104 |
| 717.0 | 0.076 |
| 716.0 | 0.101 |
| 715.0 | 0.15 |
| 714.0 | 0.17 |
| 713.0 | 0.135 |
| 712.0 | 0.074 |
| 711.0 | 0.04 |
| 710.0 | 0.058 |
| 709.0 | 0.104 |
| 708.0 | 0.12 |
| 707.0 | 0.089 |
| 706.0 | 0.065 |
| 705.0 | 0.101 |
| 704.0 | 0.191 |
| 703.0 | 0.28 |
| 702.0 | 0.313 |
| 701.0 | 0.29 |
| 700.0 | 0.26 |
| 699.0 | 0.27 |
| 698.0 | 0.323 |
| 697.0 | 0.378 |
| 696.0 | 0.39 |
| 695.0 | 0.361 |
| 694.0 | 0.33 |
| 693.0 | 0.326 |
| 692.0 | 0.348 |
| 691.0 | 0.367 |
| 690.0 | 0.361 |
| 689.0 | 0.334 |
| 688.0 | 0.313 |
| 687.0 | 0.305 |
| 686.0 | 0.303 |
| 685.0 | 0.289 |
| 684.0 | 0.262 |
| 683.0 | 0.236 |
| 682.0 | 0.219 |
| 681.0 | 0.204 |
| 680.0 | 0.179 |
| 679.0 | 0.143 |
| 678.0 | 0.108 |
| 677.0 | 0.085 |
| 676.0 | 0.073 |
| 675.0 | 0.062 |
| 674.0 | 0.046 |
| 673.0 | 0.028 |
| 672.0 | 0.016 |
| 671.0 | 0.018 |
| 670.0 | 0.042 |
| 669.0 | 0.078 |
| 668.0 | 0.104 |
| 667.0 | 0.097 |
| 666.0 | 0.061 |
| 665.0 | 0.029 |
| 664.0 | 0.031 |
| 663.0 | 0.06 |
| 662.0 | 0.08 |
| 661.0 | 0.067 |
| 660.0 | 0.034 |
| 659.0 | 0.02 |
| 658.0 | 0.035 |
| 657.0 | 0.055 |
| 656.0 | 0.051 |
| 655.0 | 0.029 |
| 654.0 | 0.015 |
| 653.0 | 0.021 |
| 652.0 | 0.033 |
| 651.0 | 0.033 |
| 650.0 | 0.024 |
| 649.0 | 0.021 |
| 648.0 | 0.034 |
| 647.0 | 0.053 |
| 646.0 | 0.06 |
| 645.0 | 0.049 |
| 644.0 | 0.032 |
| 643.0 | 0.029 |
| 642.0 | 0.045 |
| 641.0 | 0.064 |
| 640.0 | 0.063 |
| 639.0 | 0.039 |
| 638.0 | 0.021 |
| 637.0 | 0.029 |
| 636.0 | 0.049 |
| 635.0 | 0.051 |
| 634.0 | 0.032 |
| 633.0 | 0.018 |
| 632.0 | 0.023 |
| 631.0 | 0.03 |
| 630.0 | 0.023 |
| 629.0 | 0.02 |
| 628.0 | 0.042 |
| 627.0 | 0.071 |
| 626.0 | 0.07 |
| 625.0 | 0.042 |
| 624.0 | 0.033 |
| 623.0 | 0.061 |
| 622.0 | 0.093 |
| 621.0 | 0.086 |
| 620.0 | 0.051 |
| 619.0 | 0.037 |
| 618.0 | 0.055 |
| 617.0 | 0.074 |
| 616.0 | 0.062 |
| 615.0 | 0.032 |
| 614.0 | 0.017 |
| 613.0 | 0.018 |
| 612.0 | 0.02 |
| 611.0 | 0.015 |
| 610.0 | 0.011 |
| 609.0 | 0.017 |
| 608.0 | 0.031 |
| 607.0 | 0.041 |
| 606.0 | 0.035 |
| 605.0 | 0.02 |
| 604.0 | 0.013 |
| 603.0 | 0.018 |
| 602.0 | 0.024 |
| 601.0 | 0.02 |
| 600.0 | 0.011 |
| 599.0 | 0.01 |
| 598.0 | 0.014 |
| 597.0 | 0.013 |
| 596.0 | 0.008 |
| 595.0 | 0.005 |
| 594.0 | 0.006 |
| 593.0 | 0.006 |
| 592.0 | 0.004 |
| 591.0 | 0.003 |
| 590.0 | 0.002 |
| 589.0 | 0.003 |
| 588.0 | 0.002 |
| 587.0 | 0.002 |
| 586.0 | 0.003 |
| 585.0 | 0.002 |
| 584.0 | 0.002 |
| 583.0 | 0.003 |
| 582.0 | 0.002 |
| 581.0 | 0.002 |
| 580.0 | 0.002 |
| 579.0 | 0.002 |
| 578.0 | 0.002 |
| 577.0 | 0.003 |
| 576.0 | 0.002 |
| 575.0 | 0.002 |
| 574.0 | 0.002 |
| 573.0 | 0.002 |
| 572.0 | 0.002 |
| 571.0 | 0.002 |
| 570.0 | 0.01 |
| 569.0 | 0.01 |
| 568.0 | 0.009 |
| 567.0 | 0.009 |
| 566.0 | 0.006 |
| 565.0 | 0.012 |
| 564.0 | 0.01 |
| 563.0 | 0.004 |
| 562.0 | 0.011 |
| 561.0 | 0.01 |
| 560.0 | 0.01 |
| 559.0 | 0.01 |
| 558.0 | 0.008 |
| 557.0 | 0.009 |
| 556.0 | 0.01 |
| 555.0 | 0.011 |
| 554.0 | 0.008 |
| 553.0 | 0.01 |
| 552.0 | 0.008 |
| 551.0 | 0.008 |
| 550.0 | 0.008 |
| 549.0 | 0.007 |
| 548.0 | 0.009 |
| 547.0 | 0.007 |
| 546.0 | 0.004 |
| 545.0 | 0.006 |
| 544.0 | 0.007 |
| 543.0 | 0.01 |
| 542.0 | 0.004 |
| 541.0 | 0.011 |
| 540.0 | 0.01 |
| 539.0 | 0.01 |
| 538.0 | 0.01 |
| 537.0 | 0.008 |
| 536.0 | 0.009 |
| 535.0 | 0.01 |
| 534.0 | 0.011 |
| 533.0 | 0.009 |
| 532.0 | 0.01 |
| 531.0 | 0.008 |
| 530.0 | 0.01 |
| 529.0 | 0.01 |
| 528.0 | 0.009 |
| 527.0 | 0.011 |
| 526.0 | 0.007 |
| 525.0 | 0.006 |
| 524.0 | 0.006 |
| 523.0 | 0.007 |
| 522.0 | 0.007 |
| 521.0 | 0.004 |
| 520.0 | 0.006 |
| 519.0 | 0.007 |
| 518.0 | 0.01 |
| 517.0 | 0.01 |
| 516.0 | 0.009 |
| 515.0 | 0.009 |
| 514.0 | 0.006 |
| 513.0 | 0.011 |
| 512.0 | 0.01 |
| 511.0 | 0.004 |
| 510.0 | 0.011 |
| 509.0 | 0.005 |
| 508.0 | 0.005 |
| 507.0 | 0.009 |
| 506.0 | 0.008 |
| 505.0 | 0.009 |
| 504.0 | 0.01 |
| 503.0 | 0.011 |
| 502.0 | 0.008 |
| 501.0 | 0.01 |
| 500.0 | 0.008 |
| 499.0 | 0.01 |
| 498.0 | 0.01 |
| 497.0 | 0.009 |
| 496.0 | 0.011 |
| 495.0 | 0.011 |
| 494.0 | 0.01 |
| 493.0 | 0.01 |
| 492.0 | 0.011 |
| 491.0 | 0.01 |
| 490.0 | 0.008 |
| 489.0 | 0.011 |
| 488.0 | 0.009 |
| 487.0 | 0.009 |
| 486.0 | 0.009 |
| 485.0 | 0.012 |
| 484.0 | 0.009 |
| 483.0 | 0.01 |
| 482.0 | 0.011 |
| 481.0 | 0.008 |
| 480.0 | 0.01 |
| 479.0 | 0.008 |
| 478.0 | 0.01 |
| 477.0 | 0.01 |
| 476.0 | 0.009 |
| 475.0 | 0.011 |
| 474.0 | 0.007 |
| 473.0 | 0.006 |
| 472.0 | 0.006 |
| 471.0 | 0.007 |
| 470.0 | 0.007 |
| 469.0 | 0.004 |
| 468.0 | 0.006 |
| 467.0 | 0.007 |
| 466.0 | 0.008 |
| 465.0 | 0.009 |
| 464.0 | 0.01 |
| 463.0 | 0.011 |
| 462.0 | 0.008 |
| 461.0 | 0.01 |
| 460.0 | 0.008 |
| 459.0 | 0.01 |
| 458.0 | 0.01 |
| 457.0 | 0.009 |
| 456.0 | 0.011 |
| 455.0 | 0.009 |
| 454.0 | 0.01 |
| 453.0 | 0.012 |
| 452.0 | 0.009 |
| 451.0 | 0.009 |
| 450.0 | 0.005 |
| 449.0 | 0.007 |
| 448.0 | 0.009 |
| 447.0 | 0.009 |
| 446.0 | 0.01 |
| 445.0 | 0.009 |
| 444.0 | 0.01 |
| 443.0 | 0.011 |
| 442.0 | 0.008 |
| 441.0 | 0.01 |
| 440.0 | 0.008 |
| 439.0 | 0.007 |
| 438.0 | 0.008 |
| 437.0 | 0.007 |
| 436.0 | 0.008 |
| 435.0 | 0.007 |
| 434.0 | 0.004 |
| 433.0 | 0.006 |
| 432.0 | 0.007 |
| 431.0 | 0.007 |
| 430.0 | 0.004 |
| 429.0 | 0.006 |
| 428.0 | 0.007 |
| 427.0 | 0.008 |
| 426.0 | 0.007 |
| 425.0 | 0.008 |
| 424.0 | 0.009 |
| 423.0 | 0.01 |
| 422.0 | 0.01 |
| 421.0 | 0.01 |
| 420.0 | 0.009 |
| 419.0 | 0.011 |
| 418.0 | 0.007 |
| 417.0 | 0.007 |
| 416.0 | 0.007 |
| 415.0 | 0.002 |
| 414.0 | 0.009 |
| 413.0 | 0.007 |
| 412.0 | 0.008 |
| 411.0 | 0.046 |
| 410.0 | 0.753 |
| 409.0 | 2.618 |
| 408.0 | 3.74 |
| 407.0 | 5.031 |
| 406.0 | 5.462 |
| 405.0 | 6.017 |
| 404.0 | 5.421 |
| 403.0 | 6.569 |
| 402.0 | 5.291 |
| 401.0 | 3.595 |
| 400.0 | 2.747 |
| 399.0 | 0.648 |
| 398.0 | 0.039 |
| 397.0 | 0.009 |
| 396.0 | 0.007 |
| 395.0 | 0.008 |
| 394.0 | 0.007 |
| 393.0 | 0.01 |
| 392.0 | 0.009 |
| 391.0 | 0.011 |
| 390.0 | 0.009 |
| 389.0 | 0.011 |
| 388.0 | 0.01 |
| 387.0 | 0.01 |
| 386.0 | 0.01 |
| 385.0 | 0.01 |
| 384.0 | 0.009 |
| 383.0 | 0.009 |
| 382.0 | 0.006 |
| 381.0 | 0.012 |
| 380.0 | 0.01 |
| 379.0 | 0.004 |
| 378.0 | 0.011 |
| 377.0 | 0.01 |
| 376.0 | 0.01 |
| 375.0 | 0.01 |
| 374.0 | 0.008 |
| 373.0 | 0.009 |
| 372.0 | 0.01 |
| 371.0 | 0.011 |
| 370.0 | 0.009 |
| 369.0 | 0.01 |
| 368.0 | 0.008 |
| 367.0 | 0.01 |
| 366.0 | 0.01 |
| 365.0 | 0.009 |
| 364.0 | 0.011 |
| 363.0 | 0.007 |
| 362.0 | 0.004 |
| 361.0 | 0.006 |
| 360.0 | 0.007 |
| 359.0 | 0.01 |
| 358.0 | 0.01 |
| 357.0 | 0.011 |
| 356.0 | 0.016 |
| 355.0 | 0.023 |
| 354.0 | 0.037 |
| 353.0 | 0.058 |
| 352.0 | 0.088 |
| 351.0 | 0.125 |
| 350.0 | 0.164 |
| 349.0 | 0.182 |
| 348.0 | 0.168 |
| 347.0 | 0.144 |
| 346.0 | 0.135 |
| 345.0 | 0.139 |
| 344.0 | 0.14 |
| 343.0 | 0.14 |
| 342.0 | 0.153 |
| 341.0 | 0.176 |
| 340.0 | 0.2 |
| 339.0 | 0.226 |
| 338.0 | 0.266 |
| 337.0 | 0.31 |
| 336.0 | 0.337 |
| 335.0 | 0.351 |
| 334.0 | 0.375 |
| 333.0 | 0.423 |
| 332.0 | 0.481 |
| 331.0 | 0.519 |
| 330.0 | 0.54 |
| 329.0 | 0.562 |
| 328.0 | 0.597 |
| 327.0 | 0.646 |
| 326.0 | 0.701 |
| 325.0 | 0.749 |
| 324.0 | 0.782 |
| 323.0 | 0.813 |
| 322.0 | 0.849 |
| 321.0 | 0.867 |
| 320.0 | 0.831 |
| 319.0 | 0.771 |
| 318.0 | 0.745 |
| 317.0 | 0.764 |
| 316.0 | 0.807 |
| 315.0 | 0.848 |
| 314.0 | 0.876 |
| 313.0 | 0.925 |
| 312.0 | 0.998 |
| 311.0 | 1.049 |
| 310.0 | 1.104 |
| 309.0 | 1.258 |
| 308.0 | 1.54 |
| 307.0 | 1.877 |
| 306.0 | 2.182 |
| 305.0 | 2.564 |
| 304.0 | 3.235 |
| 303.0 | 4.223 |
| 302.0 | 4.524 |
| 301.0 | 4.524 |
| 300.0 | 4.775 |
| 299.0 | 4.43 |
| 298.0 | 4.15 |
| 297.0 | 5.921 |
| 296.0 | 4.401 |
| 295.0 | 5.318 |
| 294.0 | 5.016 |
| 293.0 | 4.388 |
| 292.0 | 4.317 |
| 291.0 | 4.576 |
| 290.0 | 4.387 |
| 289.0 | 5.618 |
| 288.0 | 4.556 |
| 287.0 | 4.374 |
| 286.0 | 4.132 |
| 285.0 | 5.218 |
| 284.0 | 4.337 |
| 283.0 | 5.917 |
| 282.0 | 4.962 |
| 281.0 | 4.348 |
| 280.0 | 4.16 |
| 279.0 | 4.769 |
| 278.0 | 4.183 |
| 277.0 | 5.614 |
| 276.0 | 4.659 |
| 275.0 | 4.383 |
| 274.0 | 4.129 |
| 273.0 | 5.613 |
| 272.0 | 4.346 |
| 271.0 | 5.312 |
| 270.0 | 4.834 |
| 269.0 | 4.301 |
| 268.0 | 4.135 |
| 267.0 | 5.01 |
| 266.0 | 4.767 |
| 265.0 | 4.709 |
| 264.0 | 4.834 |
| 263.0 | 4.269 |
| 262.0 | 4.164 |
| 261.0 | 4.657 |
| 260.0 | 4.259 |
| 259.0 | 4.833 |
| 258.0 | 5.213 |
| 257.0 | 4.204 |
| 256.0 | 4.331 |
| 255.0 | 4.277 |
| 254.0 | 4.266 |
| 253.0 | 4.763 |
| 252.0 | 4.795 |
| 251.0 | 4.246 |
| 250.0 | 4.296 |
| 249.0 | 4.477 |
| 248.0 | 4.245 |
| 247.0 | 4.907 |
| 246.0 | 5.907 |
| 245.0 | 4.217 |
| 244.0 | 4.283 |
| 243.0 | 4.526 |
| 242.0 | 4.316 |
| 241.0 | 4.793 |
| 240.0 | 4.866 |
| 239.0 | 4.244 |
| 238.0 | 4.263 |
| 237.0 | 4.263 |
| 236.0 | 4.327 |
| 235.0 | 4.652 |
| 234.0 | 4.866 |
| 233.0 | 4.208 |
| 232.0 | 4.225 |
| 231.0 | 4.444 |
| 230.0 | 4.253 |
| 229.0 | 4.65 |
| 228.0 | 4.728 |
| 227.0 | 4.18 |
| 226.0 | 4.335 |
| 225.0 | 4.56 |
| 224.0 | 4.248 |
| 223.0 | 4.697 |
| 222.0 | 4.669 |
| 221.0 | 4.227 |
| 220.0 | 4.174 |
| 219.0 | 4.751 |
| 218.0 | 4.243 |
| 217.0 | 4.896 |
| 216.0 | 4.533 |
| 215.0 | 4.303 |
| 214.0 | 4.25 |
| 213.0 | 4.28 |
| 212.0 | 4.22 |
| 211.0 | 4.891 |
| 210.0 | 4.548 |
| 209.0 | 4.199 |
| 208.0 | 4.075 |
| 207.0 | 4.526 |
| 206.0 | 4.154 |
| 205.0 | 4.564 |
| 204.0 | 4.423 |
| 203.0 | 4.129 |
| 202.0 | 4.032 |
| 201.0 | 4.119 |
| 200.0 | 3.974 |